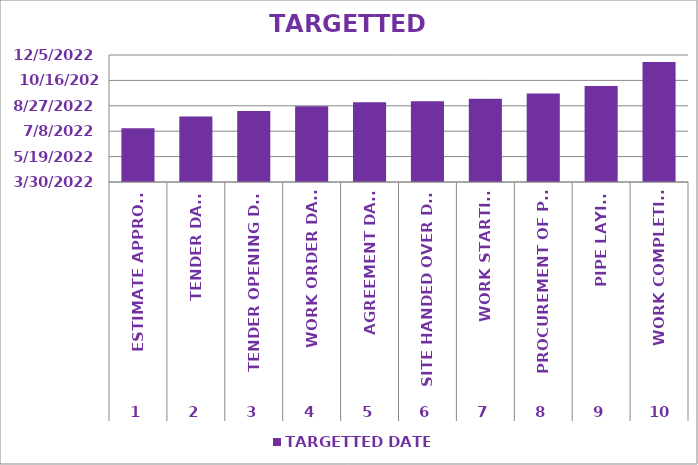
| Category | TARGETTED DATE |
|---|---|
| 0 | 7/14/22 |
| 1 | 8/6/22 |
| 2 | 8/17/22 |
| 3 | 8/26/22 |
| 4 | 9/3/22 |
| 5 | 9/5/22 |
| 6 | 9/10/22 |
| 7 | 9/20/22 |
| 8 | 10/5/22 |
| 9 | 11/21/22 |